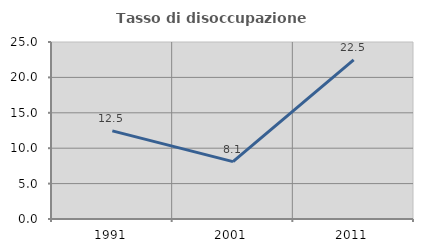
| Category | Tasso di disoccupazione giovanile  |
|---|---|
| 1991.0 | 12.452 |
| 2001.0 | 8.102 |
| 2011.0 | 22.478 |